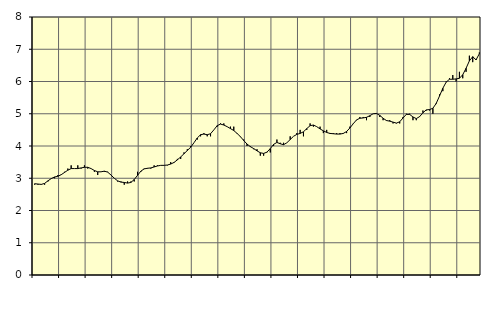
| Category | Piggar | Information och kommunikation, SNI 58-63 |
|---|---|---|
| nan | 2.8 | 2.83 |
| 87.0 | 2.8 | 2.82 |
| 87.0 | 2.8 | 2.81 |
| 87.0 | 2.8 | 2.84 |
| nan | 2.9 | 2.92 |
| 88.0 | 3 | 2.99 |
| 88.0 | 3 | 3.04 |
| 88.0 | 3.1 | 3.06 |
| nan | 3.1 | 3.11 |
| 89.0 | 3.2 | 3.18 |
| 89.0 | 3.3 | 3.25 |
| 89.0 | 3.4 | 3.3 |
| nan | 3.3 | 3.3 |
| 90.0 | 3.4 | 3.3 |
| 90.0 | 3.3 | 3.32 |
| 90.0 | 3.4 | 3.34 |
| nan | 3.3 | 3.34 |
| 91.0 | 3.3 | 3.3 |
| 91.0 | 3.2 | 3.24 |
| 91.0 | 3.1 | 3.2 |
| nan | 3.2 | 3.2 |
| 92.0 | 3.2 | 3.22 |
| 92.0 | 3.2 | 3.19 |
| 92.0 | 3.1 | 3.1 |
| nan | 3 | 3 |
| 93.0 | 2.9 | 2.92 |
| 93.0 | 2.9 | 2.88 |
| 93.0 | 2.8 | 2.87 |
| nan | 2.9 | 2.85 |
| 94.0 | 2.9 | 2.87 |
| 94.0 | 2.9 | 2.96 |
| 94.0 | 3.2 | 3.09 |
| nan | 3.2 | 3.22 |
| 95.0 | 3.3 | 3.29 |
| 95.0 | 3.3 | 3.31 |
| 95.0 | 3.3 | 3.32 |
| nan | 3.4 | 3.35 |
| 96.0 | 3.4 | 3.38 |
| 96.0 | 3.4 | 3.4 |
| 96.0 | 3.4 | 3.4 |
| nan | 3.4 | 3.41 |
| 97.0 | 3.5 | 3.44 |
| 97.0 | 3.5 | 3.49 |
| 97.0 | 3.6 | 3.57 |
| nan | 3.6 | 3.66 |
| 98.0 | 3.8 | 3.76 |
| 98.0 | 3.9 | 3.86 |
| 98.0 | 4 | 3.96 |
| nan | 4.1 | 4.1 |
| 99.0 | 4.2 | 4.25 |
| 99.0 | 4.3 | 4.35 |
| 99.0 | 4.4 | 4.37 |
| nan | 4.3 | 4.35 |
| 0.0 | 4.3 | 4.38 |
| 0.0 | 4.5 | 4.5 |
| 0.0 | 4.6 | 4.63 |
| nan | 4.7 | 4.68 |
| 1.0 | 4.7 | 4.65 |
| 1.0 | 4.6 | 4.6 |
| 1.0 | 4.6 | 4.54 |
| nan | 4.6 | 4.48 |
| 2.0 | 4.4 | 4.39 |
| 2.0 | 4.3 | 4.29 |
| 2.0 | 4.2 | 4.17 |
| nan | 4 | 4.06 |
| 3.0 | 4 | 3.98 |
| 3.0 | 3.9 | 3.92 |
| 3.0 | 3.9 | 3.85 |
| nan | 3.7 | 3.79 |
| 4.0 | 3.7 | 3.77 |
| 4.0 | 3.8 | 3.81 |
| 4.0 | 3.8 | 3.92 |
| nan | 4 | 4.05 |
| 5.0 | 4.2 | 4.11 |
| 5.0 | 4.1 | 4.07 |
| 5.0 | 4.1 | 4.04 |
| nan | 4.1 | 4.1 |
| 6.0 | 4.3 | 4.2 |
| 6.0 | 4.3 | 4.3 |
| 6.0 | 4.4 | 4.36 |
| nan | 4.5 | 4.39 |
| 7.0 | 4.3 | 4.44 |
| 7.0 | 4.5 | 4.54 |
| 7.0 | 4.7 | 4.63 |
| nan | 4.6 | 4.65 |
| 8.0 | 4.6 | 4.6 |
| 8.0 | 4.6 | 4.53 |
| 8.0 | 4.4 | 4.47 |
| nan | 4.5 | 4.42 |
| 9.0 | 4.4 | 4.39 |
| 9.0 | 4.4 | 4.38 |
| 9.0 | 4.4 | 4.37 |
| nan | 4.4 | 4.37 |
| 10.0 | 4.4 | 4.39 |
| 10.0 | 4.4 | 4.45 |
| 10.0 | 4.6 | 4.56 |
| nan | 4.7 | 4.69 |
| 11.0 | 4.8 | 4.81 |
| 11.0 | 4.9 | 4.86 |
| 11.0 | 4.9 | 4.87 |
| nan | 4.8 | 4.89 |
| 12.0 | 4.9 | 4.94 |
| 12.0 | 5 | 5 |
| 12.0 | 5 | 5.01 |
| nan | 4.9 | 4.95 |
| 13.0 | 4.8 | 4.86 |
| 13.0 | 4.8 | 4.79 |
| 13.0 | 4.8 | 4.77 |
| nan | 4.7 | 4.74 |
| 14.0 | 4.7 | 4.71 |
| 14.0 | 4.7 | 4.75 |
| 14.0 | 4.9 | 4.87 |
| nan | 5 | 4.98 |
| 15.0 | 5 | 4.98 |
| 15.0 | 4.8 | 4.9 |
| 15.0 | 4.8 | 4.85 |
| nan | 4.9 | 4.91 |
| 16.0 | 5.1 | 5.03 |
| 16.0 | 5.1 | 5.12 |
| 16.0 | 5.1 | 5.13 |
| nan | 5 | 5.17 |
| 17.0 | 5.3 | 5.32 |
| 17.0 | 5.6 | 5.55 |
| 17.0 | 5.7 | 5.79 |
| nan | 6 | 5.98 |
| 18.0 | 6.1 | 6.07 |
| 18.0 | 6.2 | 6.07 |
| 18.0 | 6 | 6.08 |
| nan | 6.3 | 6.1 |
| 19.0 | 6.1 | 6.21 |
| 19.0 | 6.3 | 6.41 |
| 19.0 | 6.8 | 6.64 |
| nan | 6.6 | 6.77 |
| 20.0 | 6.7 | 6.67 |
| 20.0 | 6.9 | 6.86 |